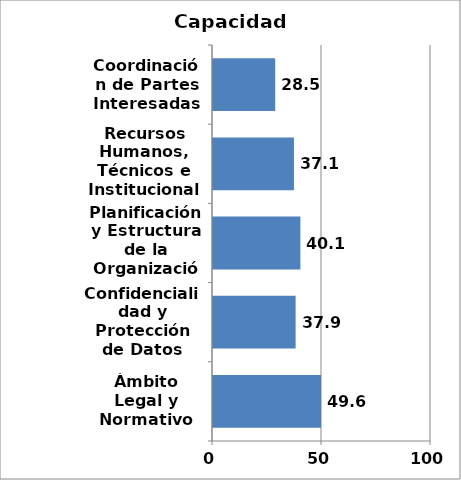
| Category | Series 0 |
|---|---|
| Ámbito Legal y Normativo | 49.568 |
| Confidencialidad y Protección de Datos | 37.897 |
| Planificación y Estructura de la Organización | 40.085 |
| Recursos Humanos, Técnicos e Institucionales | 37.137 |
| Coordinación de Partes Interesadas | 28.535 |